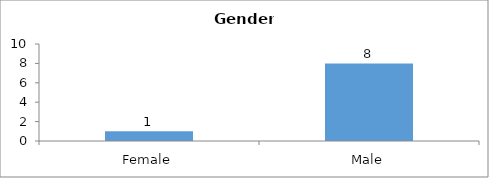
| Category | Gender |
|---|---|
| Female | 1 |
| Male | 8 |